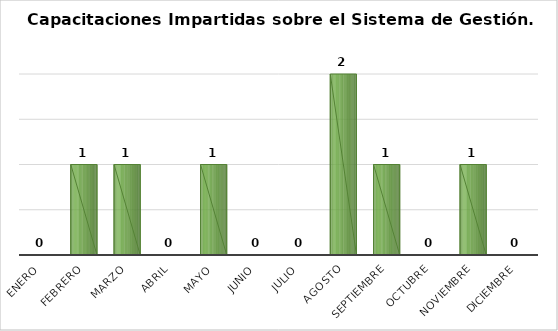
| Category | Capacitaciones impartidas/1 |
|---|---|
| Enero | 0 |
| Febrero | 1 |
| Marzo | 1 |
| Abril | 0 |
| Mayo | 1 |
| Junio | 0 |
| Julio | 0 |
| Agosto | 2 |
| Septiembre | 1 |
| Octubre | 0 |
| Noviembre | 1 |
| Diciembre | 0 |